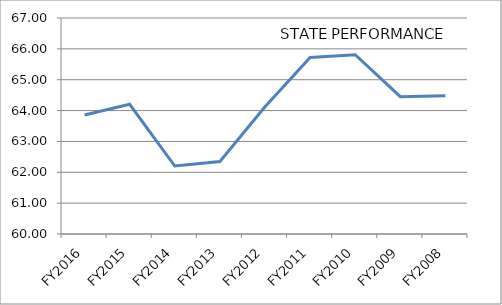
| Category | Series 0 |
|---|---|
| FY2016 | 63.855 |
| FY2015 | 64.205 |
| FY2014 | 62.203 |
| FY2013 | 62.35 |
| FY2012 | 64.125 |
| FY2011 | 65.719 |
| FY2010 | 65.81 |
| FY2009 | 64.45 |
| FY2008 | 64.48 |